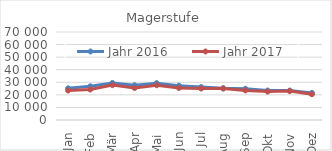
| Category | Jahr 2016 | Jahr 2017 |
|---|---|---|
| 0 | 25187.494 | 23434.349 |
| 1 | 26803.803 | 24231.928 |
| 2 | 29463.902 | 27750.984 |
| 3 | 27641.45 | 25444.677 |
| 4 | 29295.812 | 27671.439 |
| 5 | 27337.831 | 25501.27 |
| 6 | 26191.607 | 25007.045 |
| 7 | 25307.153 | 24985.933 |
| 8 | 24871.506 | 23513.636 |
| 9 | 23429.684 | 22605.32 |
| 10 | 23413.688 | 23012.357 |
| 11 | 21543.585 | 20472.043 |